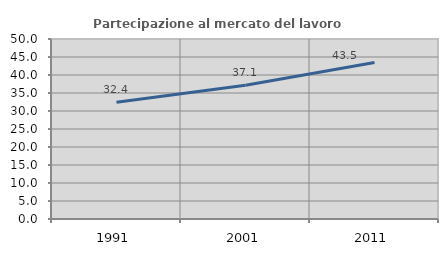
| Category | Partecipazione al mercato del lavoro  femminile |
|---|---|
| 1991.0 | 32.405 |
| 2001.0 | 37.135 |
| 2011.0 | 43.455 |